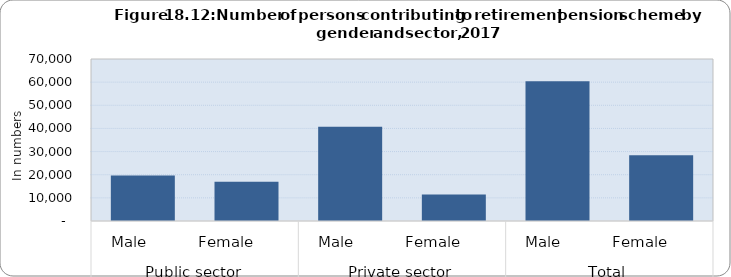
| Category | Series 0 |
|---|---|
| 0 | 19661 |
| 1 | 16964 |
| 2 | 40679 |
| 3 | 11412 |
| 4 | 60340 |
| 5 | 28376 |